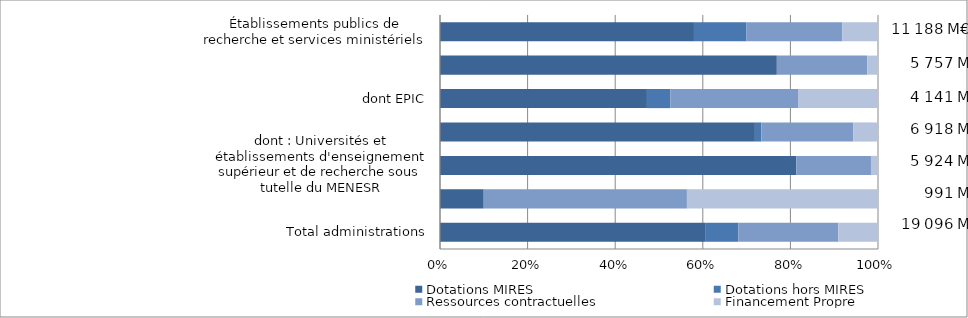
| Category | Dotations MIRES | Dotations hors MIRES | Ressources contractuelles | Financement Propre |
|---|---|---|---|---|
| Total administrations | 60.53 | 7.566 | 22.827 | 9.077 |
| Institutions sans but lucratif | 9.977 | 0 | 46.397 | 43.626 |
| dont : Universités et établissements d'enseignement supérieur et de recherche sous tutelle du MENESR | 81.337 | 0 | 17.058 | 1.605 |
| Établissements d'enseignement supérieur et de recherche | 71.895 | 1.489 | 20.952 | 5.664 |
| dont EPIC | 47.242 | 5.337 | 29.157 | 18.264 |
| dont EPST (y compris le CNRS) | 76.905 | 0 | 20.673 | 2.422 |
| Établissements publics de recherche et services ministériels | 57.982 | 11.994 | 21.899 | 8.125 |